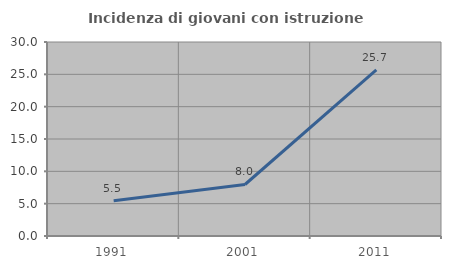
| Category | Incidenza di giovani con istruzione universitaria |
|---|---|
| 1991.0 | 5.455 |
| 2001.0 | 7.965 |
| 2011.0 | 25.676 |